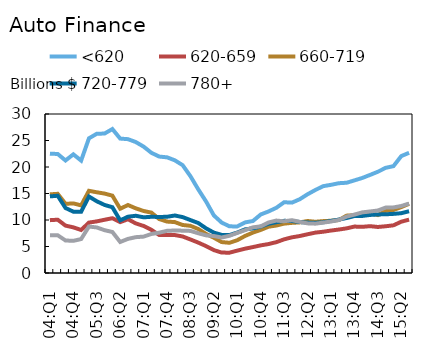
| Category | <620 | 620-659 | 660-719 | 720-779 | 780+ |
|---|---|---|---|---|---|
| 04:Q1 | 22.512 | 9.971 | 14.844 | 14.458 | 7.127 |
| 04:Q2 | 22.457 | 10.055 | 14.94 | 14.573 | 7.12 |
| 04:Q3 | 21.23 | 8.939 | 13.048 | 12.263 | 6.135 |
| 04:Q4 | 22.388 | 8.614 | 13.135 | 11.574 | 6.067 |
| 05:Q1 | 21.208 | 8.115 | 12.755 | 11.569 | 6.402 |
| 05:Q2 | 25.412 | 9.513 | 15.509 | 14.428 | 8.762 |
| 05:Q3 | 26.268 | 9.739 | 15.229 | 13.537 | 8.597 |
| 05:Q4 | 26.313 | 10.045 | 14.988 | 12.84 | 8.079 |
| 06:Q1 | 27.162 | 10.336 | 14.594 | 12.413 | 7.74 |
| 06:Q2 | 25.361 | 9.6 | 12.126 | 9.932 | 5.853 |
| 06:Q3 | 25.251 | 10.143 | 12.825 | 10.624 | 6.437 |
| 06:Q4 | 24.706 | 9.357 | 12.199 | 10.798 | 6.761 |
| 07:Q1 | 23.846 | 8.873 | 11.698 | 10.508 | 6.866 |
| 07:Q2 | 22.674 | 8.14 | 11.393 | 10.606 | 7.362 |
| 07:Q3 | 21.971 | 7.175 | 10.177 | 10.569 | 7.611 |
| 07:Q4 | 21.824 | 7.187 | 9.704 | 10.608 | 7.956 |
| 08:Q1 | 21.26 | 7.161 | 9.603 | 10.849 | 8.023 |
| 08:Q2 | 20.343 | 6.889 | 9.06 | 10.547 | 7.987 |
| 08:Q3 | 18.256 | 6.325 | 8.902 | 9.985 | 7.942 |
| 08:Q4 | 15.779 | 5.734 | 8.296 | 9.432 | 7.496 |
| 09:Q1 | 13.488 | 5.072 | 7.376 | 8.426 | 7.103 |
| 09:Q2 | 10.858 | 4.318 | 6.65 | 7.618 | 6.973 |
| 09:Q3 | 9.51 | 3.85 | 5.836 | 7.193 | 6.694 |
| 09:Q4 | 8.801 | 3.836 | 5.697 | 7.164 | 7.024 |
| 10:Q1 | 8.789 | 4.229 | 6.19 | 7.635 | 7.571 |
| 10:Q2 | 9.55 | 4.591 | 6.993 | 8.234 | 8.081 |
| 10:Q3 | 9.808 | 4.892 | 7.628 | 8.415 | 8.612 |
| 10:Q4 | 11.042 | 5.214 | 8.131 | 8.747 | 8.802 |
| 11:Q1 | 11.615 | 5.462 | 8.73 | 9.291 | 9.524 |
| 11:Q2 | 12.305 | 5.821 | 8.959 | 9.58 | 9.893 |
| 11:Q3 | 13.352 | 6.354 | 9.316 | 9.841 | 9.76 |
| 11:Q4 | 13.28 | 6.733 | 9.46 | 9.811 | 9.967 |
| 12:Q1 | 13.921 | 6.98 | 9.547 | 9.615 | 9.647 |
| 12:Q2 | 14.859 | 7.312 | 9.812 | 9.509 | 9.365 |
| 12:Q3 | 15.666 | 7.621 | 9.665 | 9.48 | 9.309 |
| 12:Q4 | 16.387 | 7.786 | 9.789 | 9.568 | 9.51 |
| 13:Q1 | 16.635 | 8.011 | 9.86 | 9.832 | 9.71 |
| 13:Q2 | 16.943 | 8.199 | 9.986 | 10.08 | 10.01 |
| 13:Q3 | 17.028 | 8.425 | 10.823 | 10.373 | 10.637 |
| 13:Q4 | 17.476 | 8.76 | 10.92 | 10.746 | 11.026 |
| 14:Q1 | 17.929 | 8.711 | 11.071 | 10.765 | 11.436 |
| 14:Q2 | 18.506 | 8.839 | 11.256 | 10.954 | 11.611 |
| 14:Q3 | 19.103 | 8.684 | 10.924 | 11.048 | 11.789 |
| 14:Q4 | 19.842 | 8.819 | 11.728 | 11.08 | 12.343 |
| 15:Q1 | 20.163 | 8.996 | 11.889 | 11.155 | 12.373 |
| 15:Q2 | 22.06 | 9.682 | 12.441 | 11.283 | 12.642 |
| 15:Q3 | 22.68 | 10.071 | 13.053 | 11.651 | 13.104 |